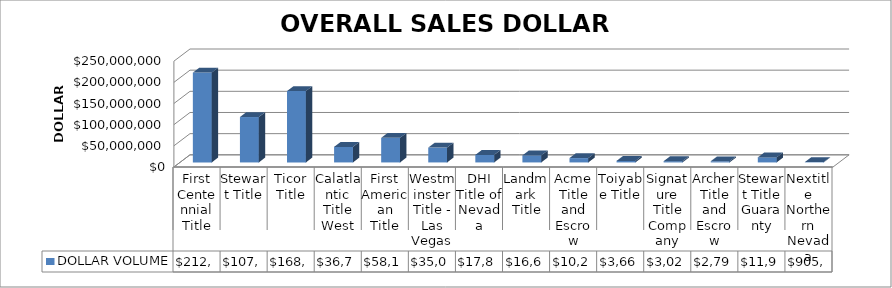
| Category | DOLLAR VOLUME |
|---|---|
| First Centennial Title | 212257453.79 |
| Stewart Title | 107260332 |
| Ticor Title | 168602802.32 |
| Calatlantic Title West | 36705068 |
| First American Title | 58121310.29 |
| Westminster Title - Las Vegas | 35053741 |
| DHI Title of Nevada | 17815363.75 |
| Landmark Title | 16644650 |
| Acme Title and Escrow | 10274000 |
| Toiyabe Title | 3669300 |
| Signature Title Company | 3026400 |
| Archer Title and Escrow | 2792000 |
| Stewart Title Guaranty | 11900000 |
| Nextitle Northern Nevada | 905000 |